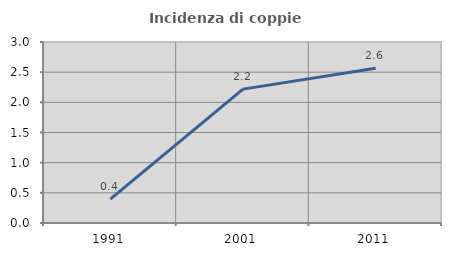
| Category | Incidenza di coppie miste |
|---|---|
| 1991.0 | 0.395 |
| 2001.0 | 2.219 |
| 2011.0 | 2.565 |